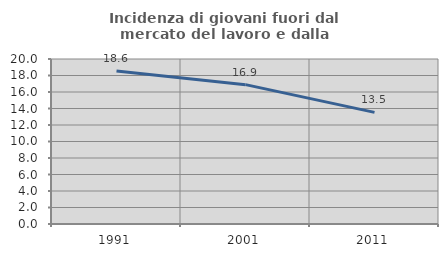
| Category | Incidenza di giovani fuori dal mercato del lavoro e dalla formazione  |
|---|---|
| 1991.0 | 18.555 |
| 2001.0 | 16.89 |
| 2011.0 | 13.529 |